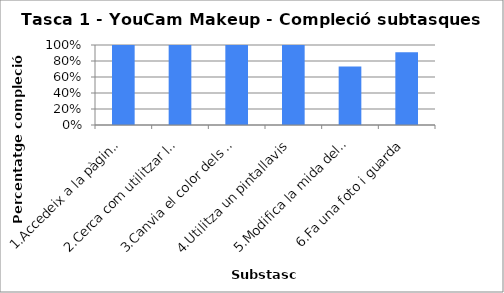
| Category | Series 0 |
|---|---|
| 1.Accedeix a la pàgina principal | 1 |
| 2.Cerca com utilitzar la càmera | 1 |
| 3.Canvia el color dels cabells | 1 |
| 4.Utilitza un pintallavis | 1 |
| 5.Modifica la mida del nas | 0.73 |
| 6.Fa una foto i guarda | 0.91 |